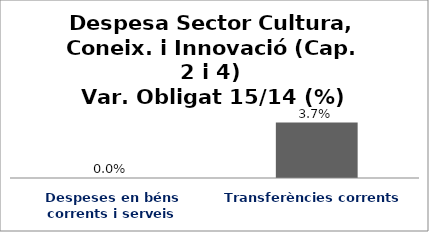
| Category | Series 0 |
|---|---|
| Despeses en béns corrents i serveis | 0 |
| Transferències corrents | 0.037 |